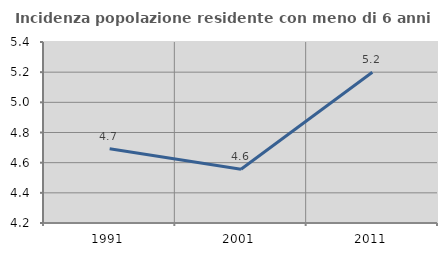
| Category | Incidenza popolazione residente con meno di 6 anni |
|---|---|
| 1991.0 | 4.692 |
| 2001.0 | 4.556 |
| 2011.0 | 5.2 |